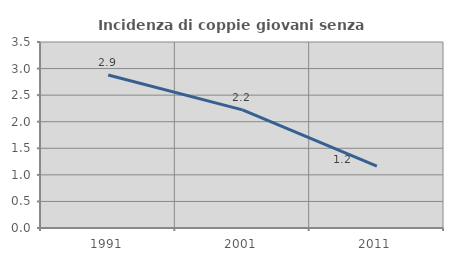
| Category | Incidenza di coppie giovani senza figli |
|---|---|
| 1991.0 | 2.878 |
| 2001.0 | 2.222 |
| 2011.0 | 1.166 |